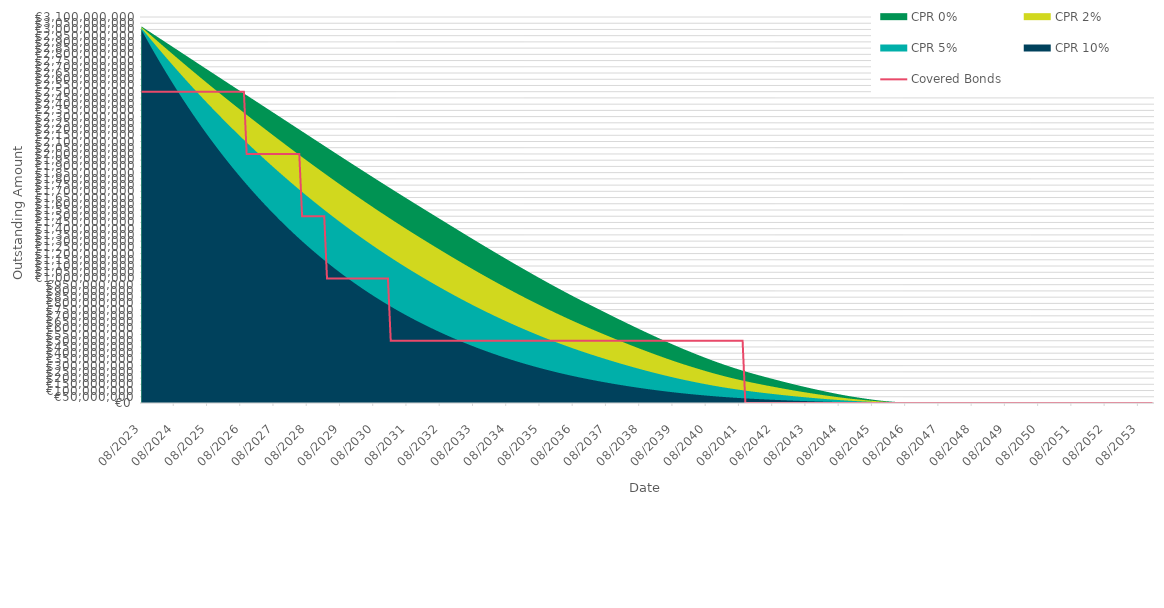
| Category | Covered Bonds |
|---|---|
| 2023-08-31 | 2500000000 |
| 2023-09-30 | 2500000000 |
| 2023-10-31 | 2500000000 |
| 2023-11-30 | 2500000000 |
| 2023-12-31 | 2500000000 |
| 2024-01-31 | 2500000000 |
| 2024-02-29 | 2500000000 |
| 2024-03-31 | 2500000000 |
| 2024-04-30 | 2500000000 |
| 2024-05-31 | 2500000000 |
| 2024-06-30 | 2500000000 |
| 2024-07-31 | 2500000000 |
| 2024-08-31 | 2500000000 |
| 2024-09-30 | 2500000000 |
| 2024-10-31 | 2500000000 |
| 2024-11-30 | 2500000000 |
| 2024-12-31 | 2500000000 |
| 2025-01-31 | 2500000000 |
| 2025-02-28 | 2500000000 |
| 2025-03-31 | 2500000000 |
| 2025-04-30 | 2500000000 |
| 2025-05-31 | 2500000000 |
| 2025-06-30 | 2500000000 |
| 2025-07-31 | 2500000000 |
| 2025-08-31 | 2500000000 |
| 2025-09-30 | 2500000000 |
| 2025-10-31 | 2500000000 |
| 2025-11-30 | 2500000000 |
| 2025-12-31 | 2500000000 |
| 2026-01-31 | 2500000000 |
| 2026-02-28 | 2500000000 |
| 2026-03-31 | 2500000000 |
| 2026-04-30 | 2500000000 |
| 2026-05-31 | 2500000000 |
| 2026-06-30 | 2500000000 |
| 2026-07-31 | 2500000000 |
| 2026-08-31 | 2500000000 |
| 2026-09-30 | 2500000000 |
| 2026-10-31 | 2000000000 |
| 2026-11-30 | 2000000000 |
| 2026-12-31 | 2000000000 |
| 2027-01-31 | 2000000000 |
| 2027-02-28 | 2000000000 |
| 2027-03-31 | 2000000000 |
| 2027-04-30 | 2000000000 |
| 2027-05-31 | 2000000000 |
| 2027-06-30 | 2000000000 |
| 2027-07-31 | 2000000000 |
| 2027-08-31 | 2000000000 |
| 2027-09-30 | 2000000000 |
| 2027-10-31 | 2000000000 |
| 2027-11-30 | 2000000000 |
| 2027-12-31 | 2000000000 |
| 2028-01-31 | 2000000000 |
| 2028-02-29 | 2000000000 |
| 2028-03-31 | 2000000000 |
| 2028-04-30 | 2000000000 |
| 2028-05-31 | 2000000000 |
| 2028-06-30 | 1500000000 |
| 2028-07-31 | 1500000000 |
| 2028-08-31 | 1500000000 |
| 2028-09-30 | 1500000000 |
| 2028-10-31 | 1500000000 |
| 2028-11-30 | 1500000000 |
| 2028-12-31 | 1500000000 |
| 2029-01-31 | 1500000000 |
| 2029-02-28 | 1500000000 |
| 2029-03-31 | 1000000000 |
| 2029-04-30 | 1000000000 |
| 2029-05-31 | 1000000000 |
| 2029-06-30 | 1000000000 |
| 2029-07-31 | 1000000000 |
| 2029-08-31 | 1000000000 |
| 2029-09-30 | 1000000000 |
| 2029-10-31 | 1000000000 |
| 2029-11-30 | 1000000000 |
| 2029-12-31 | 1000000000 |
| 2030-01-31 | 1000000000 |
| 2030-02-28 | 1000000000 |
| 2030-03-31 | 1000000000 |
| 2030-04-30 | 1000000000 |
| 2030-05-31 | 1000000000 |
| 2030-06-30 | 1000000000 |
| 2030-07-31 | 1000000000 |
| 2030-08-31 | 1000000000 |
| 2030-09-30 | 1000000000 |
| 2030-10-31 | 1000000000 |
| 2030-11-30 | 1000000000 |
| 2030-12-31 | 1000000000 |
| 2031-01-31 | 1000000000 |
| 2031-02-28 | 500000000 |
| 2031-03-31 | 500000000 |
| 2031-04-30 | 500000000 |
| 2031-05-31 | 500000000 |
| 2031-06-30 | 500000000 |
| 2031-07-31 | 500000000 |
| 2031-08-31 | 500000000 |
| 2031-09-30 | 500000000 |
| 2031-10-31 | 500000000 |
| 2031-11-30 | 500000000 |
| 2031-12-31 | 500000000 |
| 2032-01-31 | 500000000 |
| 2032-02-29 | 500000000 |
| 2032-03-31 | 500000000 |
| 2032-04-30 | 500000000 |
| 2032-05-31 | 500000000 |
| 2032-06-30 | 500000000 |
| 2032-07-31 | 500000000 |
| 2032-08-31 | 500000000 |
| 2032-09-30 | 500000000 |
| 2032-10-31 | 500000000 |
| 2032-11-30 | 500000000 |
| 2032-12-31 | 500000000 |
| 2033-01-31 | 500000000 |
| 2033-02-28 | 500000000 |
| 2033-03-31 | 500000000 |
| 2033-04-30 | 500000000 |
| 2033-05-31 | 500000000 |
| 2033-06-30 | 500000000 |
| 2033-07-31 | 500000000 |
| 2033-08-31 | 500000000 |
| 2033-09-30 | 500000000 |
| 2033-10-31 | 500000000 |
| 2033-11-30 | 500000000 |
| 2033-12-31 | 500000000 |
| 2034-01-31 | 500000000 |
| 2034-02-28 | 500000000 |
| 2034-03-31 | 500000000 |
| 2034-04-30 | 500000000 |
| 2034-05-31 | 500000000 |
| 2034-06-30 | 500000000 |
| 2034-07-31 | 500000000 |
| 2034-08-31 | 500000000 |
| 2034-09-30 | 500000000 |
| 2034-10-31 | 500000000 |
| 2034-11-30 | 500000000 |
| 2034-12-31 | 500000000 |
| 2035-01-31 | 500000000 |
| 2035-02-28 | 500000000 |
| 2035-03-31 | 500000000 |
| 2035-04-30 | 500000000 |
| 2035-05-31 | 500000000 |
| 2035-06-30 | 500000000 |
| 2035-07-31 | 500000000 |
| 2035-08-31 | 500000000 |
| 2035-09-30 | 500000000 |
| 2035-10-31 | 500000000 |
| 2035-11-30 | 500000000 |
| 2035-12-31 | 500000000 |
| 2036-01-31 | 500000000 |
| 2036-02-29 | 500000000 |
| 2036-03-31 | 500000000 |
| 2036-04-30 | 500000000 |
| 2036-05-31 | 500000000 |
| 2036-06-30 | 500000000 |
| 2036-07-31 | 500000000 |
| 2036-08-31 | 500000000 |
| 2036-09-30 | 500000000 |
| 2036-10-31 | 500000000 |
| 2036-11-30 | 500000000 |
| 2036-12-31 | 500000000 |
| 2037-01-31 | 500000000 |
| 2037-02-28 | 500000000 |
| 2037-03-31 | 500000000 |
| 2037-04-30 | 500000000 |
| 2037-05-31 | 500000000 |
| 2037-06-30 | 500000000 |
| 2037-07-31 | 500000000 |
| 2037-08-31 | 500000000 |
| 2037-09-30 | 500000000 |
| 2037-10-31 | 500000000 |
| 2037-11-30 | 500000000 |
| 2037-12-31 | 500000000 |
| 2038-01-31 | 500000000 |
| 2038-02-28 | 500000000 |
| 2038-03-31 | 500000000 |
| 2038-04-30 | 500000000 |
| 2038-05-31 | 500000000 |
| 2038-06-30 | 500000000 |
| 2038-07-31 | 500000000 |
| 2038-08-31 | 500000000 |
| 2038-09-30 | 500000000 |
| 2038-10-31 | 500000000 |
| 2038-11-30 | 500000000 |
| 2038-12-31 | 500000000 |
| 2039-01-31 | 500000000 |
| 2039-02-28 | 500000000 |
| 2039-03-31 | 500000000 |
| 2039-04-30 | 500000000 |
| 2039-05-31 | 500000000 |
| 2039-06-30 | 500000000 |
| 2039-07-31 | 500000000 |
| 2039-08-31 | 500000000 |
| 2039-09-30 | 500000000 |
| 2039-10-31 | 500000000 |
| 2039-11-30 | 500000000 |
| 2039-12-31 | 500000000 |
| 2040-01-31 | 500000000 |
| 2040-02-29 | 500000000 |
| 2040-03-31 | 500000000 |
| 2040-04-30 | 500000000 |
| 2040-05-31 | 500000000 |
| 2040-06-30 | 500000000 |
| 2040-07-31 | 500000000 |
| 2040-08-31 | 500000000 |
| 2040-09-30 | 500000000 |
| 2040-10-31 | 500000000 |
| 2040-11-30 | 500000000 |
| 2040-12-31 | 500000000 |
| 2041-01-31 | 500000000 |
| 2041-02-28 | 500000000 |
| 2041-03-31 | 500000000 |
| 2041-04-30 | 500000000 |
| 2041-05-31 | 500000000 |
| 2041-06-30 | 500000000 |
| 2041-07-31 | 500000000 |
| 2041-08-31 | 500000000 |
| 2041-09-30 | 500000000 |
| 2041-10-31 | 0 |
| 2041-11-30 | 0 |
| 2041-12-31 | 0 |
| 2042-01-31 | 0 |
| 2042-02-28 | 0 |
| 2042-03-31 | 0 |
| 2042-04-30 | 0 |
| 2042-05-31 | 0 |
| 2042-06-30 | 0 |
| 2042-07-31 | 0 |
| 2042-08-31 | 0 |
| 2042-09-30 | 0 |
| 2042-10-31 | 0 |
| 2042-11-30 | 0 |
| 2042-12-31 | 0 |
| 2043-01-31 | 0 |
| 2043-02-28 | 0 |
| 2043-03-31 | 0 |
| 2043-04-30 | 0 |
| 2043-05-31 | 0 |
| 2043-06-30 | 0 |
| 2043-07-31 | 0 |
| 2043-08-31 | 0 |
| 2043-09-30 | 0 |
| 2043-10-31 | 0 |
| 2043-11-30 | 0 |
| 2043-12-31 | 0 |
| 2044-01-31 | 0 |
| 2044-02-29 | 0 |
| 2044-03-31 | 0 |
| 2044-04-30 | 0 |
| 2044-05-31 | 0 |
| 2044-06-30 | 0 |
| 2044-07-31 | 0 |
| 2044-08-31 | 0 |
| 2044-09-30 | 0 |
| 2044-10-31 | 0 |
| 2044-11-30 | 0 |
| 2044-12-31 | 0 |
| 2045-01-31 | 0 |
| 2045-02-28 | 0 |
| 2045-03-31 | 0 |
| 2045-04-30 | 0 |
| 2045-05-31 | 0 |
| 2045-06-30 | 0 |
| 2045-07-31 | 0 |
| 2045-08-31 | 0 |
| 2045-09-30 | 0 |
| 2045-10-31 | 0 |
| 2045-11-30 | 0 |
| 2045-12-31 | 0 |
| 2046-01-31 | 0 |
| 2046-02-28 | 0 |
| 2046-03-31 | 0 |
| 2046-04-30 | 0 |
| 2046-05-31 | 0 |
| 2046-06-30 | 0 |
| 2046-07-31 | 0 |
| 2046-08-31 | 0 |
| 2046-09-30 | 0 |
| 2046-10-31 | 0 |
| 2046-11-30 | 0 |
| 2046-12-31 | 0 |
| 2047-01-31 | 0 |
| 2047-02-28 | 0 |
| 2047-03-31 | 0 |
| 2047-04-30 | 0 |
| 2047-05-31 | 0 |
| 2047-06-30 | 0 |
| 2047-07-31 | 0 |
| 2047-08-31 | 0 |
| 2047-09-30 | 0 |
| 2047-10-31 | 0 |
| 2047-11-30 | 0 |
| 2047-12-31 | 0 |
| 2048-01-31 | 0 |
| 2048-02-29 | 0 |
| 2048-03-31 | 0 |
| 2048-04-30 | 0 |
| 2048-05-31 | 0 |
| 2048-06-30 | 0 |
| 2048-07-31 | 0 |
| 2048-08-31 | 0 |
| 2048-09-30 | 0 |
| 2048-10-31 | 0 |
| 2048-11-30 | 0 |
| 2048-12-31 | 0 |
| 2049-01-31 | 0 |
| 2049-02-28 | 0 |
| 2049-03-31 | 0 |
| 2049-04-30 | 0 |
| 2049-05-31 | 0 |
| 2049-06-30 | 0 |
| 2049-07-31 | 0 |
| 2049-08-31 | 0 |
| 2049-09-30 | 0 |
| 2049-10-31 | 0 |
| 2049-11-30 | 0 |
| 2049-12-31 | 0 |
| 2050-01-31 | 0 |
| 2050-02-28 | 0 |
| 2050-03-31 | 0 |
| 2050-04-30 | 0 |
| 2050-05-31 | 0 |
| 2050-06-30 | 0 |
| 2050-07-31 | 0 |
| 2050-08-31 | 0 |
| 2050-09-30 | 0 |
| 2050-10-31 | 0 |
| 2050-11-30 | 0 |
| 2050-12-31 | 0 |
| 2051-01-31 | 0 |
| 2051-02-28 | 0 |
| 2051-03-31 | 0 |
| 2051-04-30 | 0 |
| 2051-05-31 | 0 |
| 2051-06-30 | 0 |
| 2051-07-31 | 0 |
| 2051-08-31 | 0 |
| 2051-09-30 | 0 |
| 2051-10-31 | 0 |
| 2051-11-30 | 0 |
| 2051-12-31 | 0 |
| 2052-01-31 | 0 |
| 2052-02-29 | 0 |
| 2052-03-31 | 0 |
| 2052-04-30 | 0 |
| 2052-05-31 | 0 |
| 2052-06-30 | 0 |
| 2052-07-31 | 0 |
| 2052-08-31 | 0 |
| 2052-09-30 | 0 |
| 2052-10-31 | 0 |
| 2052-11-30 | 0 |
| 2052-12-31 | 0 |
| 2053-01-31 | 0 |
| 2053-02-28 | 0 |
| 2053-03-31 | 0 |
| 2053-04-30 | 0 |
| 2053-05-31 | 0 |
| 2053-06-30 | 0 |
| 2053-07-31 | 0 |
| 2053-08-31 | 0 |
| 2053-09-30 | 0 |
| 2053-10-31 | 0 |
| 2053-11-30 | 0 |
| 2053-12-31 | 0 |
| 2054-01-31 | 0 |